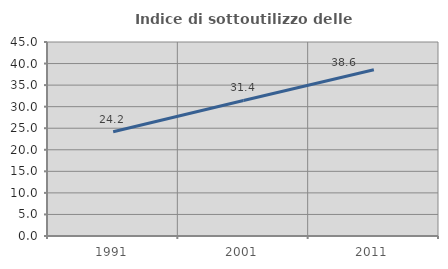
| Category | Indice di sottoutilizzo delle abitazioni  |
|---|---|
| 1991.0 | 24.191 |
| 2001.0 | 31.435 |
| 2011.0 | 38.573 |